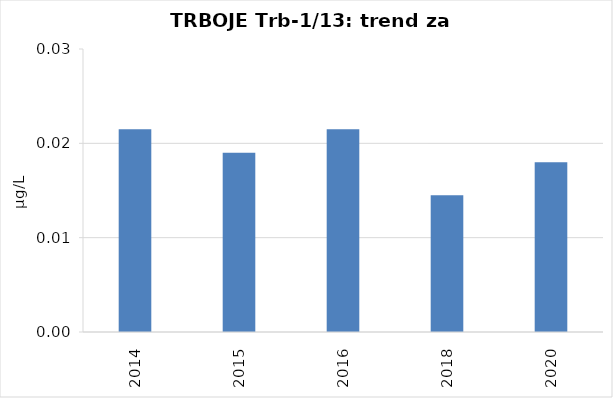
| Category | Vsota |
|---|---|
| 2014 | 0.022 |
| 2015 | 0.019 |
| 2016 | 0.022 |
| 2018 | 0.014 |
| 2020 | 0.018 |